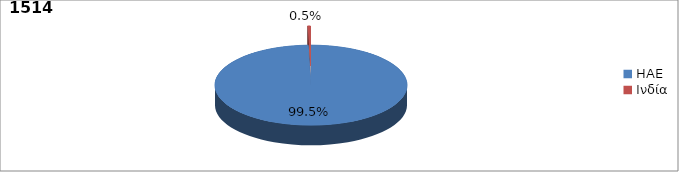
| Category | Series 0 |
|---|---|
| ΗΑΕ | 0.995 |
| Ινδία | 0.005 |